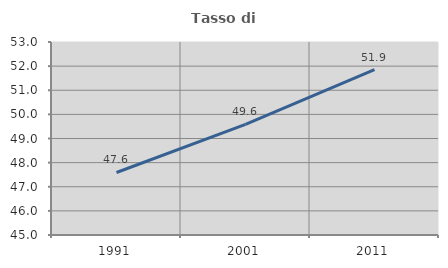
| Category | Tasso di occupazione   |
|---|---|
| 1991.0 | 47.592 |
| 2001.0 | 49.582 |
| 2011.0 | 51.859 |